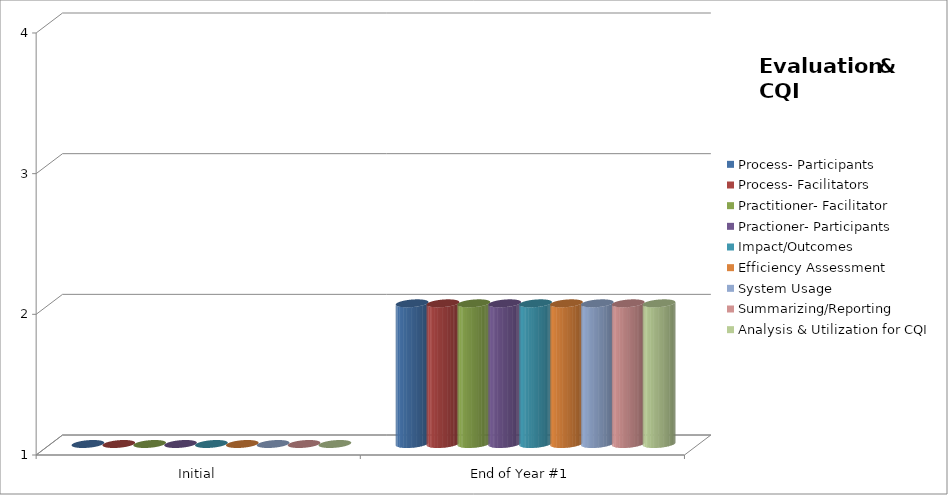
| Category | Process- Participants  | Process- Facilitators | Practitioner- Facilitator  | Practioner- Participants | Impact/Outcomes  | Efficiency Assessment  | System Usage  | Summarizing/Reporting | Analysis & Utilization for CQI |
|---|---|---|---|---|---|---|---|---|---|
| Initial | 1 | 1 | 1 | 1 | 1 | 1 | 1 | 1 | 1 |
| End of Year #1 | 2 | 2 | 2 | 2 | 2 | 2 | 2 | 2 | 2 |